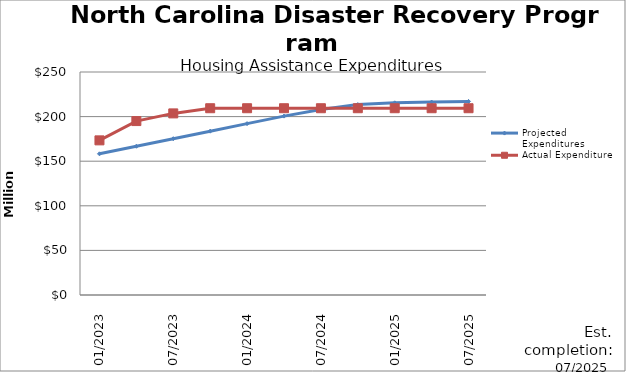
| Category | Projected Expenditures | Actual Expenditure |
|---|---|---|
| 01/2023 | 158292027.785 | 173359061.57 |
| 4/2023 | 166746096.785 | 194989205.57 |
| 07/2023 | 175200167.785 | 203594960.67 |
| 10/2023 | 183654238.785 | 209395244.82 |
| 01/2024 | 192108309.785 | 209395244.82 |
| 4/2024 | 200562380.785 | 209395244.82 |
| 07/2024 | 208016451.785 | 209395244.82 |
| 10/2024 | 213470522.785 | 209395244.82 |
| 01/2025 | 215470522.785 | 209395244.82 |
| 4/2025 | 216265440.785 | 209395244.82 |
| 07/2025 | 217022549.785 | 209395244.82 |